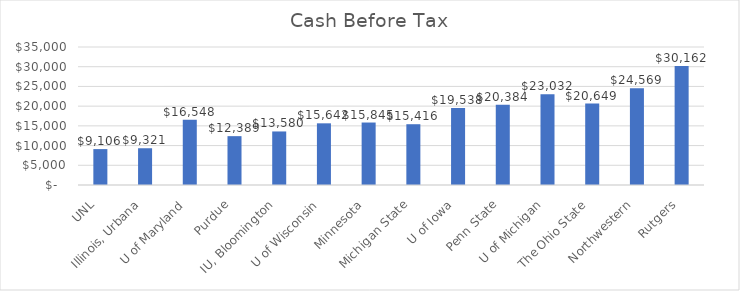
| Category | Series 0 |
|---|---|
|  UNL  | 9105.886 |
|  Illinois, Urbana  | 9320.92 |
|  U of Maryland  | 16548.2 |
|  Purdue  | 12388.8 |
|  IU, Bloomington  | 13579.54 |
|  U of Wisconsin  | 15642 |
|  Minnesota  | 15845.402 |
|  Michigan State  | 15416 |
|  U of Iowa  | 19538.35 |
|  Penn State  | 20384 |
|  U of Michigan  | 23031.81 |
|  The Ohio State  | 20648.8 |
|  Northwestern  | 24569 |
|  Rutgers  | 30162 |